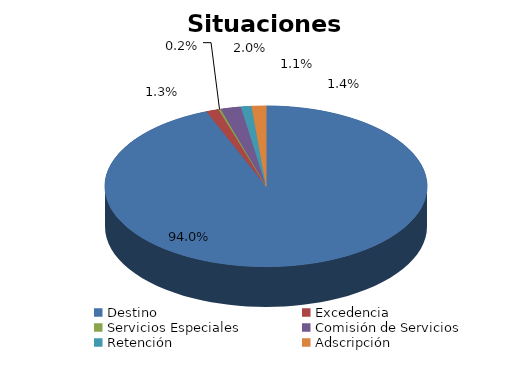
| Category | Series 0 |
|---|---|
| Destino | 2481 |
| Excedencia | 33 |
| Servicios Especiales | 6 |
| Comisión de Servicios | 54 |
| Retención | 28 |
| Adscripción | 38 |